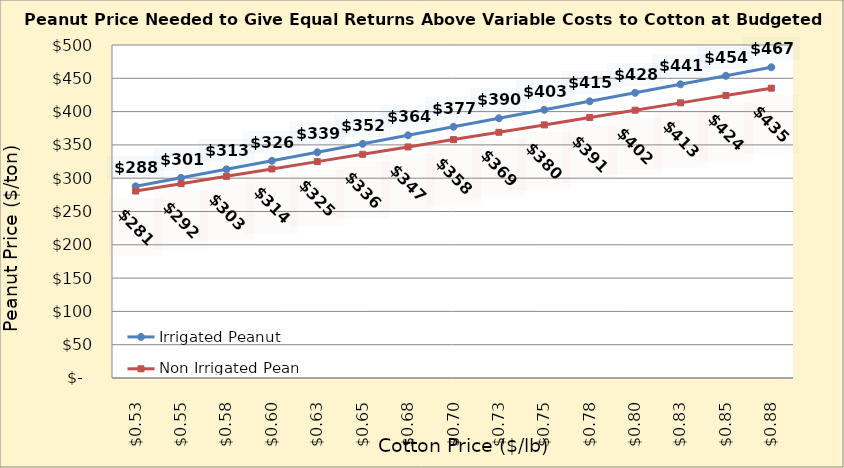
| Category | Irrigated Peanut | Non Irrigated Peanut |
|---|---|---|
| 0.5249999999999998 | 287.81 | 280.756 |
| 0.5499999999999998 | 300.576 | 291.786 |
| 0.5749999999999998 | 313.342 | 302.815 |
| 0.5999999999999999 | 326.108 | 313.844 |
| 0.6249999999999999 | 338.874 | 324.874 |
| 0.6499999999999999 | 351.64 | 335.903 |
| 0.6749999999999999 | 364.406 | 346.933 |
| 0.7 | 377.172 | 357.962 |
| 0.725 | 389.938 | 368.991 |
| 0.75 | 402.704 | 380.021 |
| 0.775 | 415.47 | 391.05 |
| 0.8 | 428.236 | 402.08 |
| 0.8250000000000001 | 441.002 | 413.109 |
| 0.8500000000000001 | 453.768 | 424.139 |
| 0.8750000000000001 | 466.534 | 435.168 |